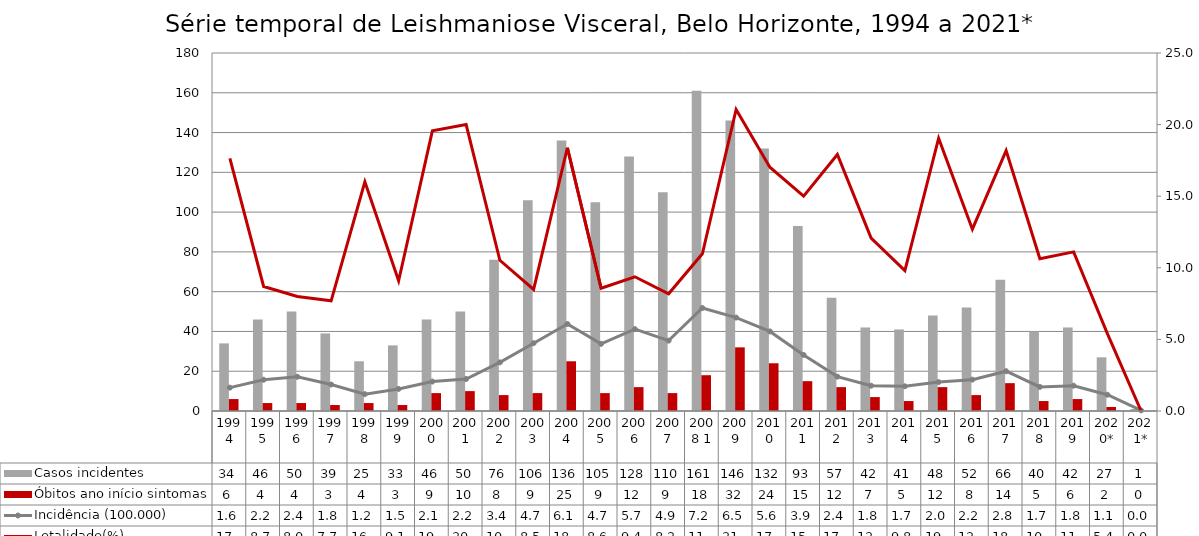
| Category | Casos incidentes | Óbitos ano início sintomas |
|---|---|---|
| 1994 | 34 | 6 |
| 1995 | 46 | 4 |
| 1996 | 50 | 4 |
| 1997 | 39 | 3 |
| 1998 | 25 | 4 |
| 1999 | 33 | 3 |
| 2000 | 46 | 9 |
| 2001 | 50 | 10 |
| 2002 | 76 | 8 |
| 2003 | 106 | 9 |
| 2004 | 136 | 25 |
| 2005 | 105 | 9 |
| 2006 | 128 | 12 |
| 2007 | 110 | 9 |
| 2008 1 | 161 | 18 |
| 2009 | 146 | 32 |
| 2010 | 132 | 24 |
| 2011 | 93 | 15 |
| 2012 | 57 | 12 |
| 2013 | 42 | 7 |
| 2014 | 41 | 5 |
| 2015 | 48 | 12 |
| 2016 | 52 | 8 |
| 2017 | 66 | 14 |
| 2018 | 40 | 5 |
| 2019 | 42 | 6 |
| 2020* | 27 | 2 |
| 2021* | 1 | 0 |